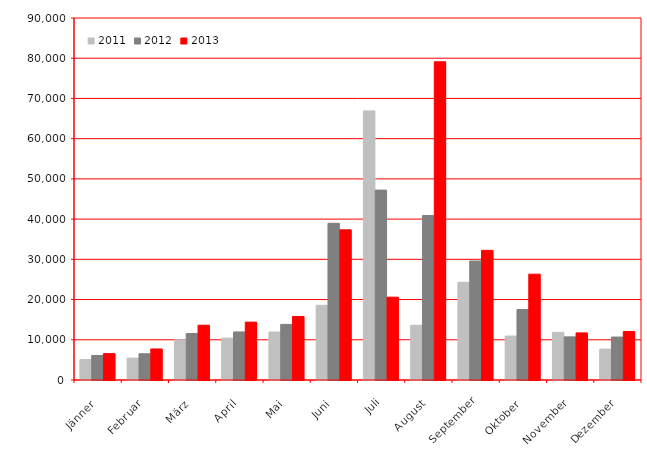
| Category | 2011 | 2012 | 2013 |
|---|---|---|---|
| Jänner | 5081 | 6095 | 6557 |
| Februar | 5438 | 6522 | 7715 |
| März | 9993 | 11559 | 13623 |
| April | 10400 | 11947 | 14385 |
| Mai | 11923 | 13827 | 15796 |
| Juni | 18576 | 38966 | 37336 |
| Juli | 66906 | 47213 | 20590 |
| August | 13595 | 40899 | 79122 |
| September | 24289 | 29589 | 32233 |
| Oktober | 10924 | 17509 | 26308 |
| November | 11854 | 10724 | 11708 |
| Dezember | 7693 | 10676 | 12063 |